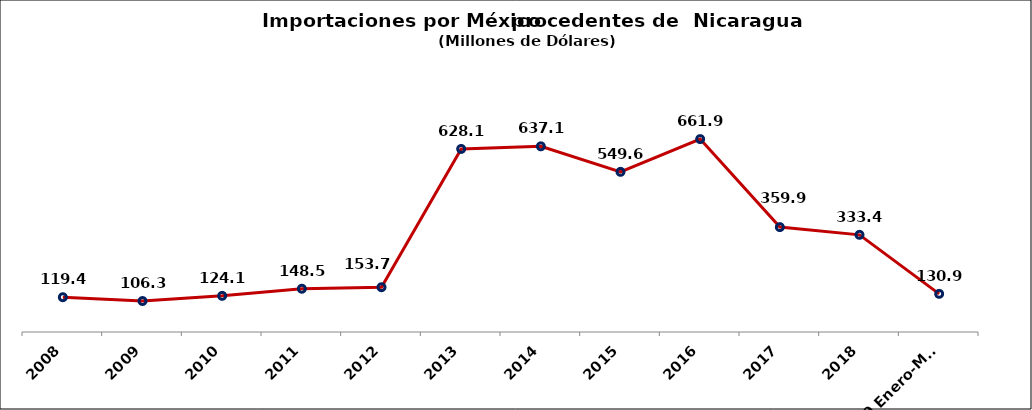
| Category | Series 0 |
|---|---|
| 2008 | 119.36 |
| 2009 | 106.285 |
| 2010 | 124.064 |
| 2011 | 148.45 |
| 2012 | 153.656 |
| 2013 | 628.144 |
| 2014 | 637.129 |
| 2015 | 549.557 |
| 2016 | 661.938 |
| 2017 | 359.9 |
| 2018 | 333.4 |
| 2019 Enero-Mayo | 130.9 |